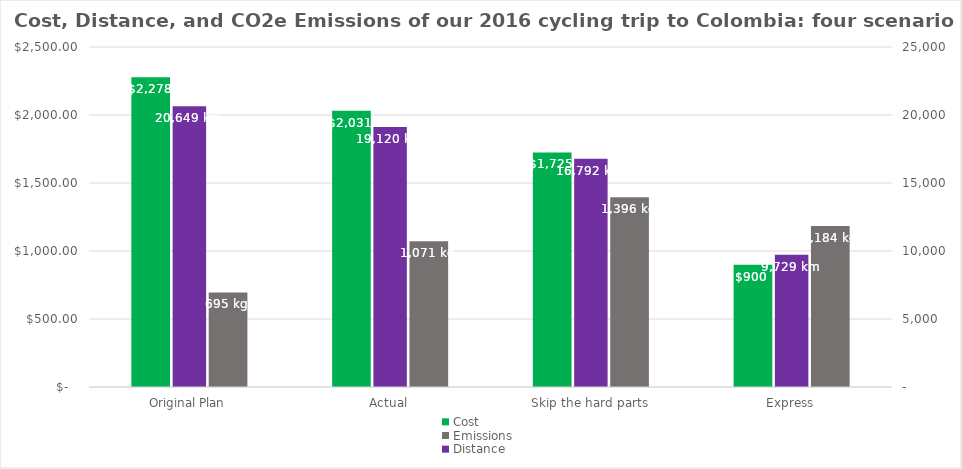
| Category | Cost | Emissions |
|---|---|---|
| Original Plan | 2278.1 | 695.35 |
| Actual | 2031.19 | 1071.07 |
| Skip the hard parts | 1725.016 | 1395.513 |
| Express | 899.646 | 1183.689 |